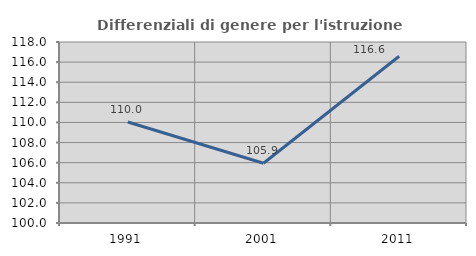
| Category | Differenziali di genere per l'istruzione superiore |
|---|---|
| 1991.0 | 110.049 |
| 2001.0 | 105.937 |
| 2011.0 | 116.587 |